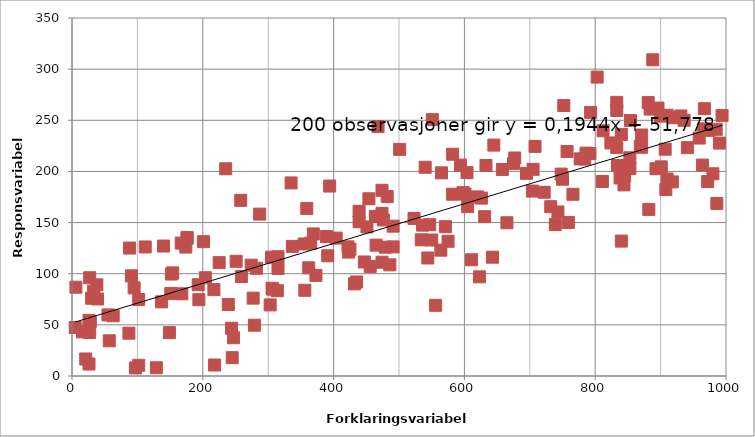
| Category | Series 1 |
|---|---|
| 454.0 | 173.261 |
| 193.0 | 89.232 |
| 33.0 | 82.96 |
| 677.0 | 213.135 |
| 140.0 | 127.05 |
| 556.0 | 69.122 |
| 833.0 | 223.287 |
| 305.0 | 116.182 |
| 27.0 | 96.057 |
| 582.0 | 177.722 |
| 986.0 | 168.719 |
| 217.0 | 84.426 |
| 571.0 | 145.98 |
| 306.0 | 85.683 |
| 844.0 | 186.844 |
| 235.0 | 202.604 |
| 151.0 | 80.744 |
| 26.0 | 45.486 |
| 931.0 | 254.224 |
| 21.0 | 16.649 |
| 626.0 | 173.902 |
| 391.0 | 117.52 |
| 244.0 | 46.689 |
| 792.0 | 217.43 |
| 468.0 | 243.846 |
| 16.0 | 43.106 |
| 784.0 | 212.163 |
| 994.0 | 254.714 |
| 598.0 | 179.275 |
| 544.0 | 115.368 |
| 6.0 | 86.812 |
| 425.0 | 123.902 |
| 258.0 | 171.726 |
| 845.0 | 195.754 |
| 853.0 | 202.801 |
| 307.0 | 84.859 |
| 315.0 | 105.16 |
| 853.0 | 213.348 |
| 137.0 | 72.496 |
| 777.0 | 212.258 |
| 834.0 | 205.82 |
| 95.0 | 86.12 |
| 456.0 | 107.126 |
| 812.0 | 239.788 |
| 465.0 | 127.944 |
| 594.0 | 206.172 |
| 565.0 | 198.606 |
| 919.0 | 252.514 |
| 748.0 | 197.384 |
| 896.0 | 261.961 |
| 447.0 | 111.478 |
| 959.0 | 232.634 |
| 404.0 | 134.831 |
| 972.0 | 190.125 |
| 803.0 | 292.241 |
| 601.0 | 177.835 |
| 643.0 | 116.152 |
| 675.0 | 207.616 |
| 752.0 | 264.411 |
| 743.0 | 160.384 |
| 168.0 | 80.37 |
| 474.0 | 111.229 |
| 287.0 | 158.266 |
| 369.0 | 138.901 |
| 990.0 | 227.708 |
| 980.0 | 197.698 |
| 722.0 | 179.614 |
| 645.0 | 225.735 |
| 840.0 | 236.203 |
| 564.0 | 123.023 |
| 833.0 | 259.582 |
| 833.0 | 267.544 |
| 695.0 | 198.124 |
| 907.0 | 221.746 |
| 88.0 | 125.073 |
| 985.0 | 241.168 |
| 112.0 | 126.156 |
| 708.0 | 224.483 |
| 356.0 | 83.812 |
| 57.0 | 34.418 |
| 239.0 | 69.878 |
| 394.0 | 185.697 |
| 102.0 | 74.827 |
| 247.0 | 37.413 |
| 63.0 | 58.886 |
| 869.0 | 224.556 |
| 575.0 | 131.716 |
| 884.0 | 260.955 |
| 967.0 | 261.337 |
| 274.0 | 108.355 |
| 605.0 | 165.604 |
| 176.0 | 135.488 |
| 423.0 | 121.152 |
| 194.0 | 74.637 |
| 277.0 | 76.118 |
| 491.0 | 146.487 |
| 27.0 | 42.535 |
| 534.0 | 133.155 |
| 633.0 | 205.815 |
| 251.0 | 112.16 |
| 389.0 | 136.351 |
| 840.0 | 131.876 |
| 335.0 | 188.759 |
| 282.0 | 105.346 |
| 167.0 | 129.955 |
| 28.0 | 53.269 |
| 550.0 | 132.932 |
| 245.0 | 17.939 |
| 129.0 | 8.026 |
| 365.0 | 129.821 |
| 303.0 | 69.5 |
| 439.0 | 161.048 |
| 259.0 | 97.263 |
| 451.0 | 145.738 |
| 30.0 | 76.03 |
| 176.0 | 134.476 |
| 759.0 | 150.105 |
| 482.0 | 175.432 |
| 314.0 | 83.37 |
| 918.0 | 189.777 |
| 910.0 | 254.942 |
| 201.0 | 131.384 |
| 315.0 | 116.605 |
| 824.0 | 227.89 |
| 888.0 | 309.132 |
| 5.0 | 47.412 |
| 540.0 | 204.08 |
| 658.0 | 201.93 |
| 854.0 | 249.795 |
| 474.0 | 159.032 |
| 910.0 | 192.57 |
| 547.0 | 147.905 |
| 154.0 | 100.826 |
| 152.0 | 99.682 |
| 432.0 | 90.06 |
| 439.0 | 150.802 |
| 966.0 | 241.626 |
| 704.0 | 180.8 |
| 665.0 | 149.819 |
| 882.0 | 162.842 |
| 102.0 | 10.487 |
| 604.0 | 198.847 |
| 620.0 | 175.12 |
| 786.0 | 217.875 |
| 631.0 | 155.77 |
| 750.0 | 192.388 |
| 55.0 | 59.732 |
| 523.0 | 154 |
| 204.0 | 96.061 |
| 476.0 | 152.552 |
| 623.0 | 96.95 |
| 337.0 | 126.711 |
| 871.0 | 223.602 |
| 536.0 | 147.514 |
| 732.0 | 165.528 |
| 355.0 | 129.045 |
| 881.0 | 267.323 |
| 974.0 | 240.159 |
| 373.0 | 98.338 |
| 901.0 | 204.458 |
| 26.0 | 11.713 |
| 218.0 | 10.743 |
| 941.0 | 223.219 |
| 435.0 | 91.921 |
| 871.0 | 235.602 |
| 739.0 | 148.052 |
| 893.0 | 202.635 |
| 838.0 | 193.599 |
| 611.0 | 113.64 |
| 474.0 | 181.581 |
| 464.0 | 155.984 |
| 87.0 | 41.867 |
| 359.0 | 163.86 |
| 422.0 | 126.27 |
| 964.0 | 206.215 |
| 97.0 | 7.883 |
| 39.0 | 75.313 |
| 479.0 | 125.906 |
| 908.0 | 182.303 |
| 936.0 | 249.958 |
| 362.0 | 105.758 |
| 149.0 | 42.433 |
| 811.0 | 190.188 |
| 900.0 | 254.078 |
| 91.0 | 97.946 |
| 582.0 | 216.803 |
| 793.0 | 257.712 |
| 705.0 | 202.026 |
| 279.0 | 49.652 |
| 225.0 | 110.849 |
| 757.0 | 219.508 |
| 38.0 | 89.118 |
| 766.0 | 177.667 |
| 491.0 | 126.213 |
| 486.0 | 108.648 |
| 501.0 | 221.559 |
| 551.0 | 250.65 |
| 174.0 | 126.039 |
| 52.0 | -2.051 |
| 26.0 | 54.376 |